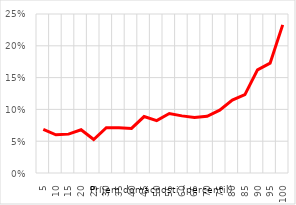
| Category | VS_zahr |
|---|---|
| 5.0 | 0.069 |
| 10.0 | 0.06 |
| 15.0 | 0.061 |
| 20.0 | 0.068 |
| 25.0 | 0.053 |
| 30.0 | 0.071 |
| 35.0 | 0.071 |
| 40.0 | 0.07 |
| 45.0 | 0.089 |
| 50.0 | 0.082 |
| 55.0 | 0.094 |
| 60.0 | 0.09 |
| 65.0 | 0.087 |
| 70.0 | 0.089 |
| 75.0 | 0.099 |
| 80.0 | 0.115 |
| 85.0 | 0.123 |
| 90.0 | 0.162 |
| 95.0 | 0.173 |
| 100.0 | 0.233 |